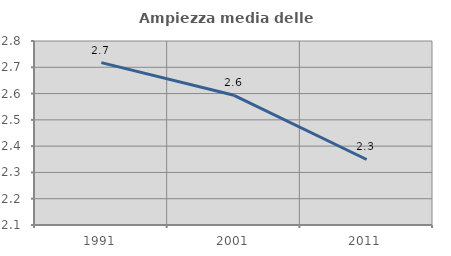
| Category | Ampiezza media delle famiglie |
|---|---|
| 1991.0 | 2.718 |
| 2001.0 | 2.593 |
| 2011.0 | 2.349 |